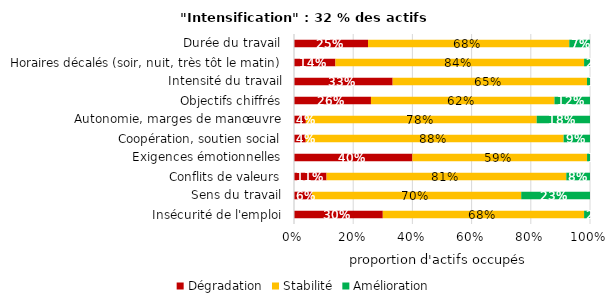
| Category | Dégradation | Stabilité | Amélioration |
|---|---|---|---|
| Insécurité de l'emploi | 0.3 | 0.68 | 0.02 |
| Sens du travail | 0.06 | 0.7 | 0.23 |
| Conflits de valeurs | 0.11 | 0.81 | 0.08 |
| Exigences émotionnelles | 0.4 | 0.59 | 0.01 |
| Coopération, soutien social | 0.04 | 0.88 | 0.09 |
| Autonomie, marges de manœuvre | 0.04 | 0.78 | 0.18 |
| Objectifs chiffrés | 0.26 | 0.62 | 0.12 |
| Intensité du travail | 0.33 | 0.65 | 0.01 |
| Horaires décalés (soir, nuit, très tôt le matin) | 0.14 | 0.84 | 0.02 |
| Durée du travail | 0.25 | 0.68 | 0.07 |